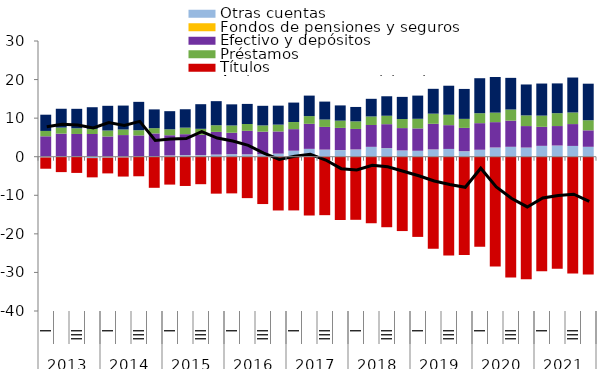
| Category | Otras cuentas | Fondos de pensiones y seguros | Efectivo y depósitos | Préstamos  | Títulos | Acciones y otras participaciones  |
|---|---|---|---|---|---|---|
| 0 | -0.186 | 0.013 | 5.282 | 1.39 | -2.928 | 4.209 |
| 1 | -0.075 | 0.013 | 5.969 | 1.573 | -3.917 | 4.879 |
| 2 | -0.062 | 0.013 | 5.885 | 1.474 | -4.139 | 5.046 |
| 3 | -0.363 | 0.013 | 5.876 | 1.331 | -4.991 | 5.609 |
| 4 | -0.244 | 0.013 | 5.238 | 1.543 | -4.081 | 6.405 |
| 5 | -0.196 | 0.014 | 5.599 | 1.441 | -4.951 | 6.204 |
| 6 | 0.013 | 0.014 | 5.491 | 1.353 | -5.071 | 7.353 |
| 7 | -0.078 | 0.014 | 6.022 | 1.367 | -7.983 | 4.867 |
| 8 | 0.316 | 0.014 | 5.239 | 1.534 | -7.228 | 4.704 |
| 9 | 0.402 | 0.014 | 5.424 | 1.695 | -7.585 | 4.77 |
| 10 | 0.404 | 0.015 | 5.26 | 1.555 | -7.127 | 6.383 |
| 11 | 0.544 | 0.015 | 5.876 | 1.723 | -9.576 | 6.246 |
| 12 | 0.657 | 0.014 | 5.545 | 1.886 | -9.506 | 5.475 |
| 13 | 0.614 | 0.014 | 6.083 | 1.777 | -10.736 | 5.202 |
| 14 | 0.625 | 0.014 | 5.853 | 1.623 | -12.273 | 5.085 |
| 15 | 0.783 | 0.014 | 5.754 | 1.767 | -13.937 | 4.921 |
| 16 | 1.543 | 0.014 | 5.591 | 1.844 | -13.924 | 5.043 |
| 17 | 2.024 | 0.014 | 6.488 | 2.003 | -15.242 | 5.314 |
| 18 | 1.825 | 0.014 | 5.886 | 1.91 | -15.153 | 4.655 |
| 19 | 1.724 | 0.014 | 5.729 | 1.884 | -16.402 | 3.949 |
| 20 | 1.877 | 0.014 | 5.306 | 1.97 | -16.355 | 3.733 |
| 21 | 2.546 | 0.014 | 5.663 | 2.217 | -17.249 | 4.572 |
| 22 | 2.225 | 0.014 | 6.195 | 2.188 | -18.281 | 5.049 |
| 23 | 1.613 | 0.015 | 5.793 | 2.348 | -19.276 | 5.744 |
| 24 | 1.524 | 0.015 | 5.8 | 2.494 | -20.789 | 6.012 |
| 25 | 1.879 | 0.015 | 6.635 | 2.636 | -23.892 | 6.44 |
| 26 | 2 | 0.015 | 6.168 | 2.706 | -25.629 | 7.517 |
| 27 | 1.421 | 0.016 | 6.033 | 2.342 | -25.497 | 7.761 |
| 28 | 1.788 | 0.016 | 6.894 | 2.582 | -23.336 | 9.069 |
| 29 | 2.375 | 0.015 | 6.574 | 2.467 | -28.493 | 9.232 |
| 30 | 2.556 | 0.015 | 6.779 | 2.886 | -31.285 | 8.209 |
| 31 | 2.359 | 0.015 | 5.57 | 2.768 | -31.751 | 8.018 |
| 32 | 2.803 | 0.015 | 4.93 | 2.909 | -29.663 | 8.313 |
| 33 | 2.89 | 0.014 | 5.047 | 3.338 | -29.039 | 7.717 |
| 34 | 2.782 | 0.014 | 5.666 | 3.01 | -30.252 | 9.059 |
| 35 | 2.555 | 0.015 | 4.269 | 2.623 | -30.52 | 9.47 |